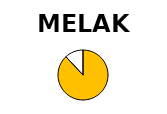
| Category | Series 1 | Series 0 |
|---|---|---|
| Operational Capacity (MW) | 50 | 33.996 |
| In progress (MW) | 6.8 | 0 |